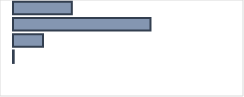
| Category | Series 0 |
|---|---|
| 0 | 25.919 |
| 1 | 60.567 |
| 2 | 13.207 |
| 3 | 0.308 |
| 4 | 0 |